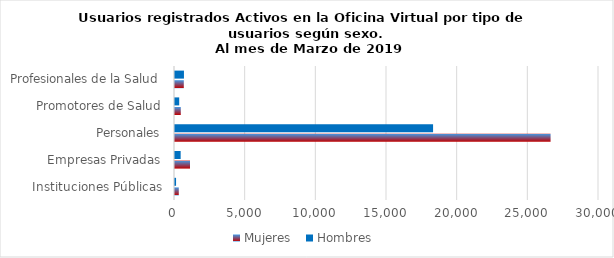
| Category | Mujeres | Hombres |
|---|---|---|
| Instituciones Públicas | 268 | 75 |
| Empresas Privadas | 1062 | 400 |
| Personales | 26574 | 18260 |
| Promotores de Salud | 409 | 297 |
| Profesionales de la Salud | 623 | 633 |